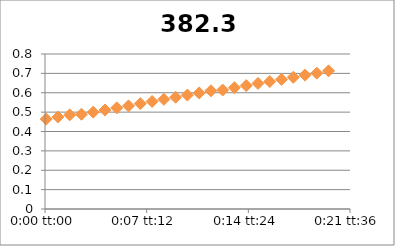
| Category | 382.3 |
|---|---|
| 5.78703703703704e-05 | 0.464 |
| 0.000636574074074074 | 0.475 |
| 0.00121527777777778 | 0.486 |
| 0.00179398148148148 | 0.489 |
| 0.00237268518518518 | 0.5 |
| 0.00295138888888889 | 0.511 |
| 0.00353009259259259 | 0.522 |
| 0.0041087962962963 | 0.532 |
| 0.0046875 | 0.544 |
| 0.0052662037037037 | 0.555 |
| 0.00584490740740741 | 0.566 |
| 0.00642361111111111 | 0.577 |
| 0.00700231481481481 | 0.588 |
| 0.00758101851851852 | 0.599 |
| 0.00815972222222222 | 0.61 |
| 0.00873842592592592 | 0.614 |
| 0.00931712962962963 | 0.626 |
| 0.00989583333333333 | 0.637 |
| 0.010474537037037 | 0.648 |
| 0.0110532407407407 | 0.658 |
| 0.0116319444444444 | 0.669 |
| 0.0122106481481481 | 0.68 |
| 0.0127893518518518 | 0.691 |
| 0.0133680555555556 | 0.701 |
| 0.0139467592592593 | 0.713 |